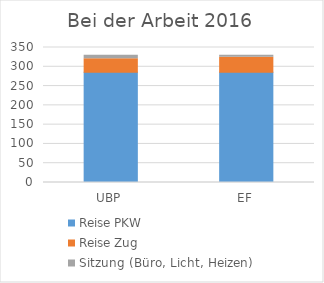
| Category | Reise PKW | Reise Zug | Sitzung (Büro, Licht, Heizen) |
|---|---|---|---|
| UBP | 286.072 | 34.555 | 9.374 |
| EF | 286.071 | 38.645 | 5.284 |